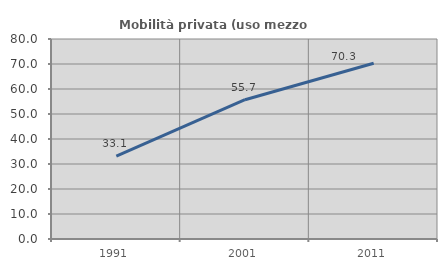
| Category | Mobilità privata (uso mezzo privato) |
|---|---|
| 1991.0 | 33.126 |
| 2001.0 | 55.711 |
| 2011.0 | 70.283 |